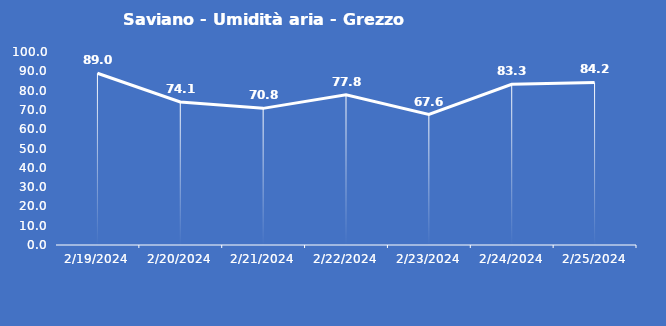
| Category | Saviano - Umidità aria - Grezzo (%) |
|---|---|
| 2/19/24 | 89 |
| 2/20/24 | 74.1 |
| 2/21/24 | 70.8 |
| 2/22/24 | 77.8 |
| 2/23/24 | 67.6 |
| 2/24/24 | 83.3 |
| 2/25/24 | 84.2 |